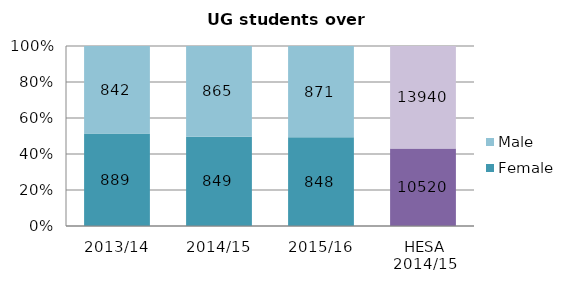
| Category | Female | Male |
|---|---|---|
| 2013/14 | 889 | 842 |
| 2014/15 | 849 | 865 |
| 2015/16 | 848 | 871 |
| HESA 2014/15 | 10520 | 13940 |